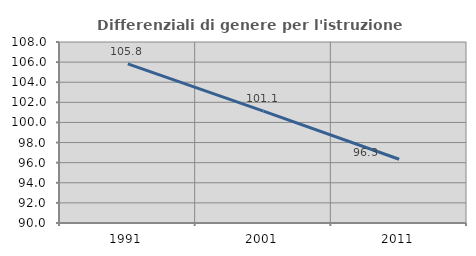
| Category | Differenziali di genere per l'istruzione superiore |
|---|---|
| 1991.0 | 105.831 |
| 2001.0 | 101.126 |
| 2011.0 | 96.34 |